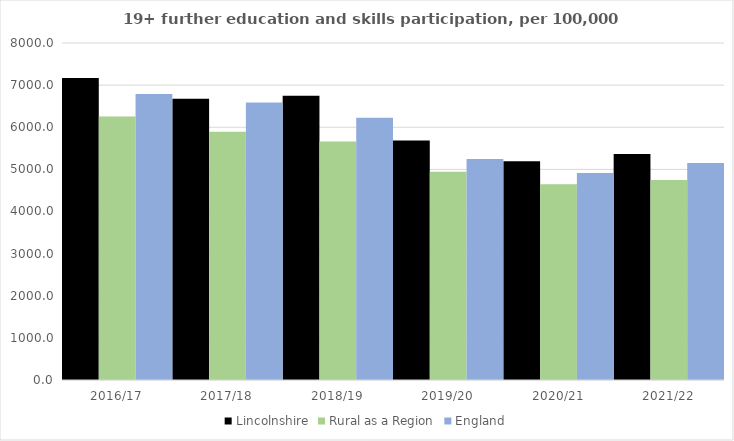
| Category | Lincolnshire | Rural as a Region | England |
|---|---|---|---|
| 2016/17 | 7171.413 | 6253.401 | 6788 |
| 2017/18 | 6673.628 | 5892.029 | 6588 |
| 2018/19 | 6746.354 | 5661.873 | 6227 |
| 2019/20 | 5685.527 | 4943.801 | 5244 |
| 2020/21 | 5193.278 | 4646.727 | 4913 |
| 2021/22 | 5364.728 | 4747.049 | 5151 |